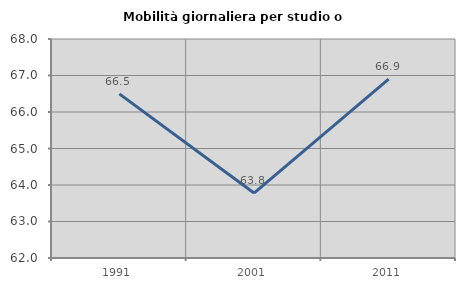
| Category | Mobilità giornaliera per studio o lavoro |
|---|---|
| 1991.0 | 66.496 |
| 2001.0 | 63.779 |
| 2011.0 | 66.9 |